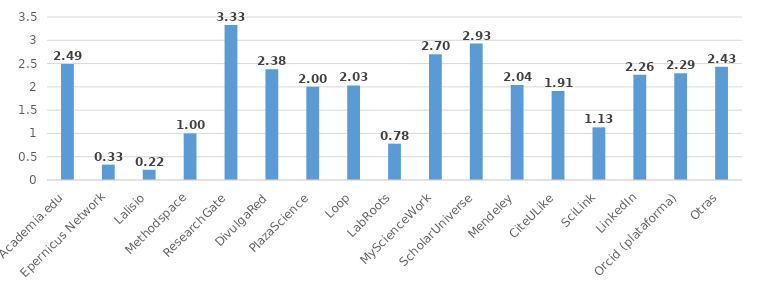
| Category | Series 0 |
|---|---|
| Academia.edu | 2.49 |
| Epernicus Network | 0.33 |
| Lalisio | 0.22 |
| Methodspace | 1 |
| ResearchGate | 3.33 |
| DivulgaRed | 2.38 |
| PlazaScience | 2 |
| Loop | 2.03 |
| LabRoots | 0.78 |
| MyScienceWork | 2.7 |
| ScholarUniverse | 2.93 |
| Mendeley | 2.04 |
| CiteULike | 1.91 |
| SciLink | 1.13 |
| LinkedIn | 2.26 |
| Orcid (plataforma) | 2.29 |
| Otras | 2.43 |